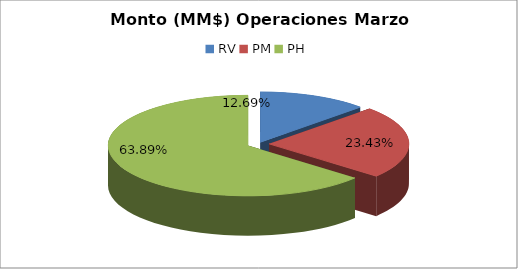
| Category | Series 0 |
|---|---|
| RV | 1535708.515 |
| PM | 2835809.166 |
| PH | 7733818.284 |